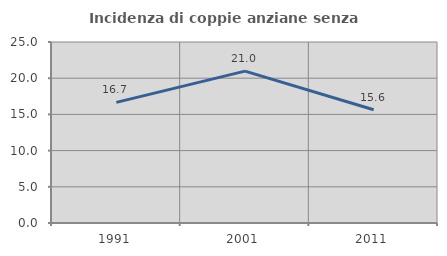
| Category | Incidenza di coppie anziane senza figli  |
|---|---|
| 1991.0 | 16.667 |
| 2001.0 | 20.979 |
| 2011.0 | 15.646 |